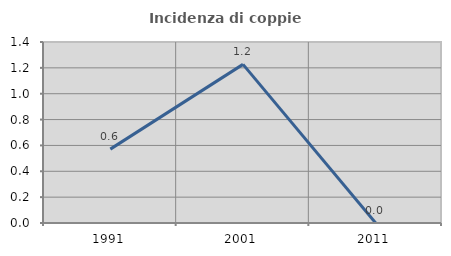
| Category | Incidenza di coppie miste |
|---|---|
| 1991.0 | 0.571 |
| 2001.0 | 1.227 |
| 2011.0 | 0 |